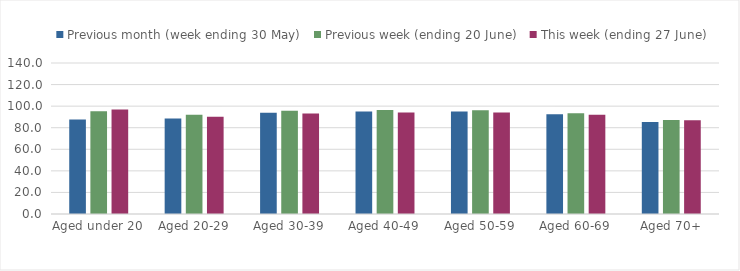
| Category | Previous month (week ending 30 May) | Previous week (ending 20 June) | This week (ending 27 June) |
|---|---|---|---|
| Aged under 20 | 87.501 | 95.373 | 96.892 |
| Aged 20-29 | 88.493 | 92.068 | 90.197 |
| Aged 30-39 | 93.86 | 95.813 | 93.238 |
| Aged 40-49 | 95.144 | 96.483 | 94.092 |
| Aged 50-59 | 95.008 | 96.265 | 94.148 |
| Aged 60-69 | 92.527 | 93.494 | 92.082 |
| Aged 70+ | 85.304 | 87.077 | 86.826 |